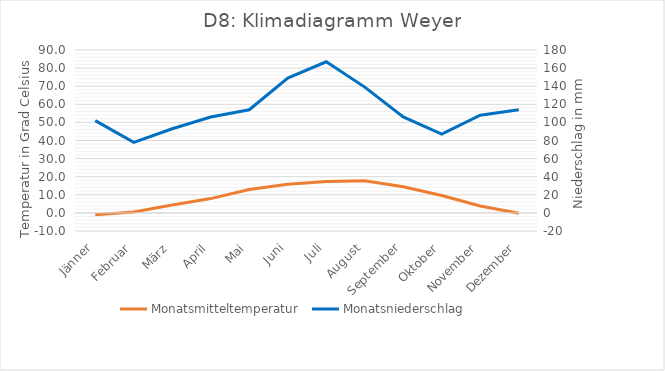
| Category | Monatsmitteltemperatur  |
|---|---|
| Jänner | -1 |
| Februar | 0.5 |
| März | 4.4 |
| April | 7.9 |
| Mai | 12.9 |
| Juni | 15.8 |
| Juli | 17.4 |
| August | 17.8 |
| September | 14.4 |
| Oktober | 9.6 |
| November | 3.8 |
| Dezember | -0.2 |